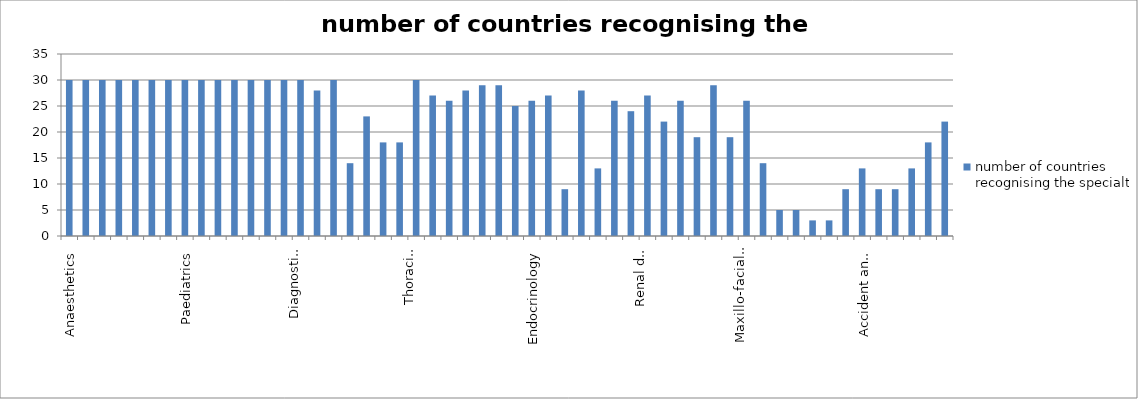
| Category | number of countries recognising the specialty |
|---|---|
| Anaesthetics | 30 |
| General surgery  | 30 |
| Neurological surgery  | 30 |
| Obstetrics and Gynaecology  | 30 |
| General (internal) medicine | 30 |
| Ophthalmology | 30 |
| Otorhinolaryngology | 30 |
| Paediatrics | 30 |
| Respiratory medicine | 30 |
| Urology | 30 |
| Orthopaedics | 30 |
| Pathological anatomy | 30 |
| Neurology | 30 |
| Psychiatry | 30 |
| Diagnostic radiology | 30 |
| Radiotherapy | 28 |
| Plastic surgery | 30 |
| Clinical biology | 14 |
| Microbiology-bacteriology  | 23 |
| Biological chemistry | 18 |
| Immunology | 18 |
| Thoracic surgery | 30 |
| Paediatric surgery | 27 |
| Vascular surgery | 26 |
| Cardiology | 28 |
| Gastroenterology | 29 |
| Rheumatology | 29 |
| General Haematology | 25 |
| Endocrinology | 26 |
| Physiotherapy | 27 |
| Neuropsychiatry | 9 |
| Dermato-venereology | 28 |
| Radiology | 13 |
| Child psychiatry | 26 |
| Geriatrics | 24 |
| Renal diseases | 27 |
| Communicable diseases | 22 |
| Community medicine | 26 |
| Pharmacology | 19 |
| Occupational medicine | 29 |
| Allergology | 19 |
| Nuclear medicine | 26 |
| Maxillo-facial surgery (basic medical training) | 14 |
| Biological haematology  | 5 |
| Stomatology | 5 |
| Dermatology | 3 |
| Venerology | 3 |
| Tropical medicine | 9 |
| Gastroenterological surgery | 13 |
| Accident and emergency medicine | 9 |
| Clinical neurophysiology | 9 |
| Dental, oral and maxillo-facial surgery (basic medical and dental training)[1] | 13 |
| Medical oncology [1] | 18 |
| Medical genetics [1]  | 22 |